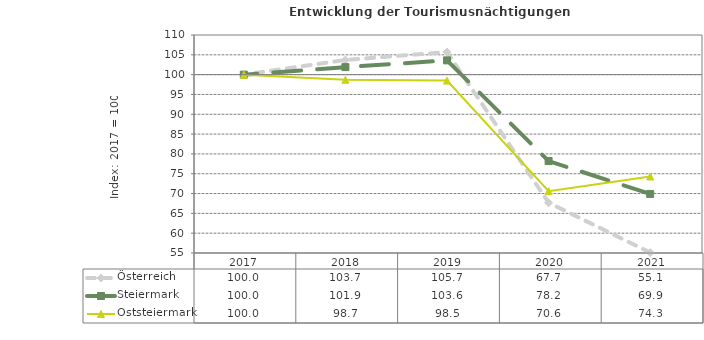
| Category | Österreich | Steiermark | Oststeiermark |
|---|---|---|---|
| 2021.0 | 55.1 | 69.9 | 74.3 |
| 2020.0 | 67.7 | 78.2 | 70.6 |
| 2019.0 | 105.7 | 103.6 | 98.5 |
| 2018.0 | 103.7 | 101.9 | 98.7 |
| 2017.0 | 100 | 100 | 100 |